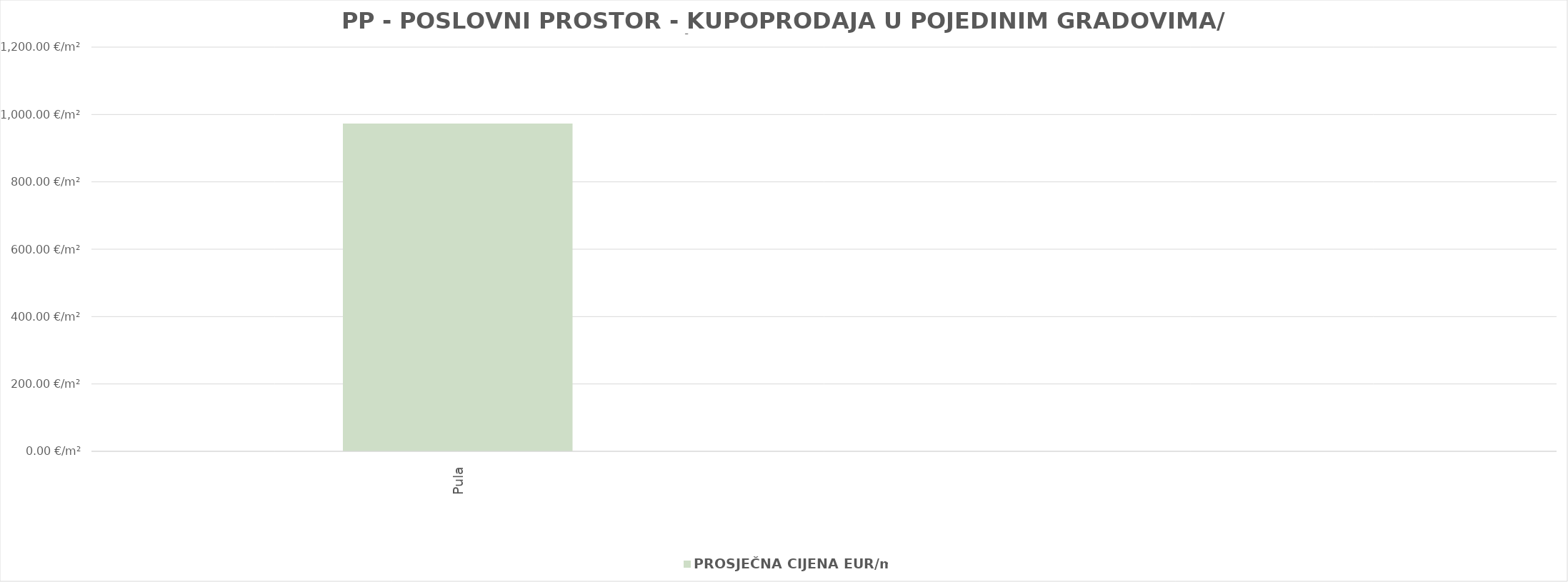
| Category | PROSJEČNA CIJENA EUR/m2 |
|---|---|
| Pula | 1902-08-30 03:13:38 |